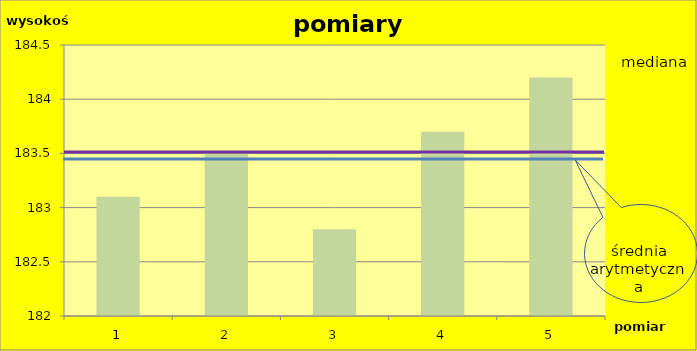
| Category | Series 0 |
|---|---|
| 0 | 183.1 |
| 1 | 183.5 |
| 2 | 182.8 |
| 3 | 183.7 |
| 4 | 184.2 |